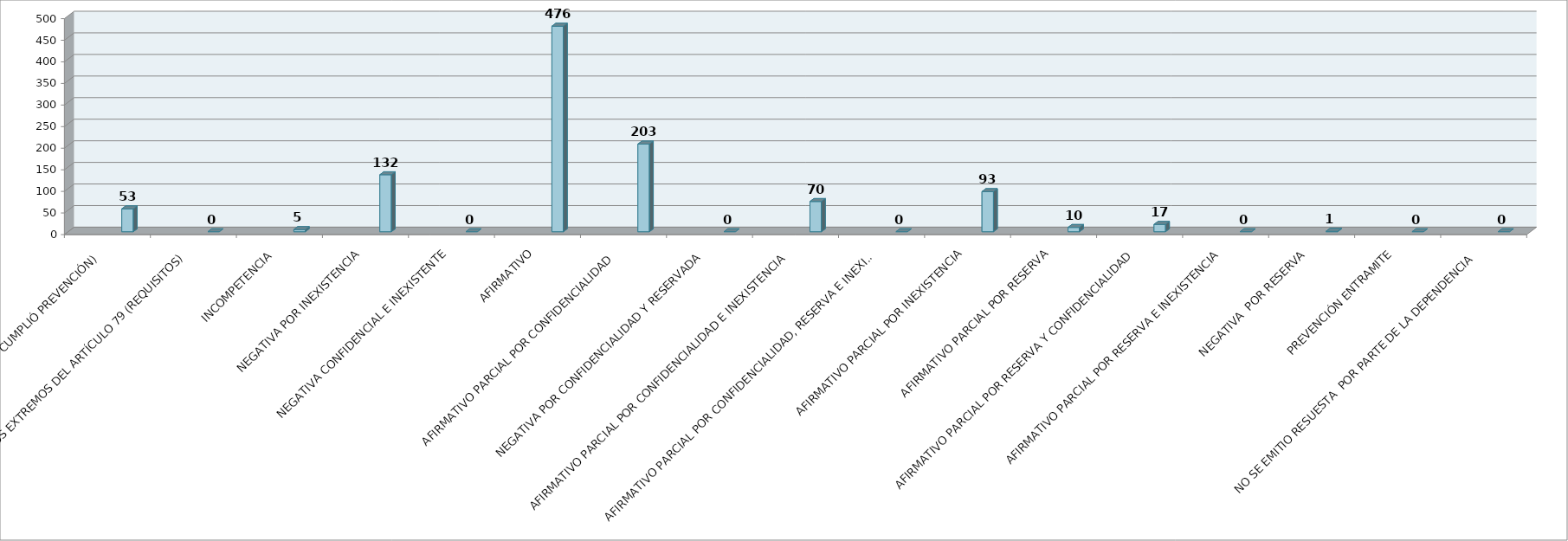
| Category | Series 0 | Series 1 | Series 2 | Series 3 | Series 4 | Series 5 |
|---|---|---|---|---|---|---|
| SE TIENE POR NO PRESENTADA ( NO CUMPLIÓ PREVENCIÓN) |  |  |  |  | 53 |  |
| NO CUMPLIO CON LOS EXTREMOS DEL ARTÍCULO 79 (REQUISITOS) |  |  |  |  | 0 |  |
| INCOMPETENCIA  |  |  |  |  | 5 |  |
| NEGATIVA POR INEXISTENCIA |  |  |  |  | 132 |  |
| NEGATIVA CONFIDENCIAL E INEXISTENTE |  |  |  |  | 0 |  |
| AFIRMATIVO |  |  |  |  | 476 |  |
| AFIRMATIVO PARCIAL POR CONFIDENCIALIDAD  |  |  |  |  | 203 |  |
| NEGATIVA POR CONFIDENCIALIDAD Y RESERVADA |  |  |  |  | 0 |  |
| AFIRMATIVO PARCIAL POR CONFIDENCIALIDAD E INEXISTENCIA |  |  |  |  | 70 |  |
| AFIRMATIVO PARCIAL POR CONFIDENCIALIDAD, RESERVA E INEXISTENCIA |  |  |  |  | 0 |  |
| AFIRMATIVO PARCIAL POR INEXISTENCIA |  |  |  |  | 93 |  |
| AFIRMATIVO PARCIAL POR RESERVA |  |  |  |  | 10 |  |
| AFIRMATIVO PARCIAL POR RESERVA Y CONFIDENCIALIDAD |  |  |  |  | 17 |  |
| AFIRMATIVO PARCIAL POR RESERVA E INEXISTENCIA |  |  |  |  | 0 |  |
| NEGATIVA  POR RESERVA |  |  |  |  | 1 |  |
| PREVENCIÓN ENTRAMITE |  |  |  |  | 0 |  |
| NO SE EMITIO RESUESTA  POR PARTE DE LA DEPENDENCIA |  |  |  |  | 0 |  |